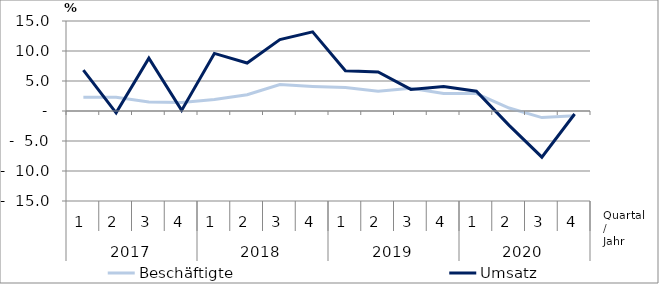
| Category | Beschäftigte | Umsatz |
|---|---|---|
| 0 | 2.3 | 6.8 |
| 1 | 2.3 | -0.3 |
| 2 | 1.5 | 8.8 |
| 3 | 1.4 | 0.1 |
| 4 | 1.9 | 9.6 |
| 5 | 2.7 | 8 |
| 6 | 4.4 | 11.9 |
| 7 | 4.1 | 13.2 |
| 8 | 3.9 | 6.7 |
| 9 | 3.3 | 6.5 |
| 10 | 3.8 | 3.6 |
| 11 | 2.9 | 4.1 |
| 12 | 2.9 | 3.3 |
| 13 | 0.5 | -2.4 |
| 14 | -1.1 | -7.7 |
| 15 | -0.8 | -0.5 |